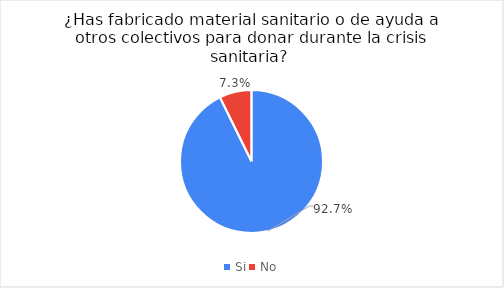
| Category | Series 0 |
|---|---|
| Si | 0.927 |
| No | 0.073 |